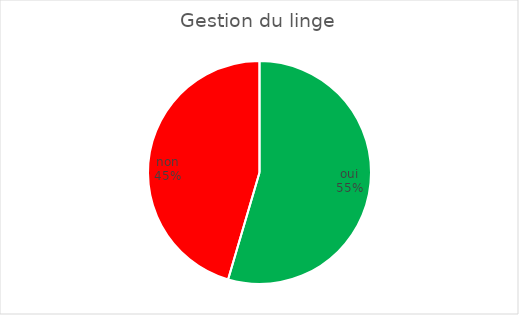
| Category | Gestion du linge |
|---|---|
| oui | 6 |
| non | 5 |